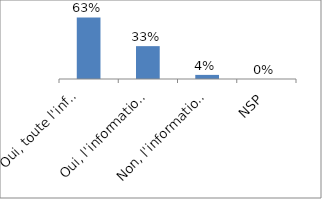
| Category | Series 0 |
|---|---|
| Oui, toute l'information est présentée_x000d_  | 0.625 |
| Oui, l'information est présentée | 0.333 |
| Non, l'information n'est pas présentée | 0.042 |
| NSP | 0 |